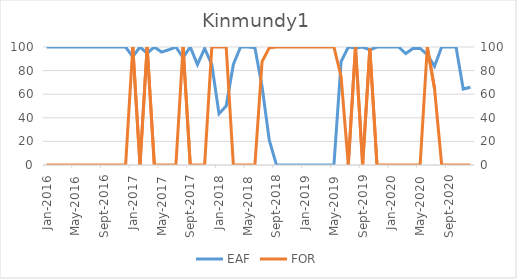
| Category | EAF |
|---|---|
| 2016-01-01 | 100 |
| 2016-02-01 | 100 |
| 2016-03-01 | 100 |
| 2016-04-01 | 100 |
| 2016-05-01 | 100 |
| 2016-06-01 | 100 |
| 2016-07-01 | 100 |
| 2016-08-01 | 100 |
| 2016-09-01 | 100 |
| 2016-10-01 | 100 |
| 2016-11-01 | 100 |
| 2016-12-01 | 100 |
| 2017-01-01 | 91.67 |
| 2017-02-01 | 100 |
| 2017-03-01 | 94.75 |
| 2017-04-01 | 100 |
| 2017-05-01 | 95.7 |
| 2017-06-01 | 97.64 |
| 2017-07-01 | 100 |
| 2017-08-01 | 91.09 |
| 2017-09-01 | 100 |
| 2017-10-01 | 85.08 |
| 2017-11-01 | 98.82 |
| 2017-12-01 | 85.08 |
| 2018-01-01 | 43.42 |
| 2018-02-01 | 50 |
| 2018-03-01 | 85.2 |
| 2018-04-01 | 100 |
| 2018-05-01 | 100 |
| 2018-06-01 | 99.45 |
| 2018-07-01 | 66.27 |
| 2018-08-01 | 21.01 |
| 2018-09-01 | 0 |
| 2018-10-01 | 0 |
| 2018-11-01 | 0 |
| 2018-12-01 | 0 |
| 2019-01-01 | 0 |
| 2019-02-01 | 0 |
| 2019-03-01 | 0 |
| 2019-04-01 | 0 |
| 2019-05-01 | 0 |
| 2019-06-01 | 87.54 |
| 2019-07-01 | 100 |
| 2019-08-01 | 99.2 |
| 2019-09-01 | 100 |
| 2019-10-01 | 97.63 |
| 2019-11-01 | 100 |
| 2019-12-01 | 100 |
| 2020-01-01 | 100 |
| 2020-02-01 | 100 |
| 2020-03-01 | 94.48 |
| 2020-04-01 | 98.75 |
| 2020-05-01 | 98.81 |
| 2020-06-01 | 93.66 |
| 2020-07-01 | 83.71 |
| 2020-08-01 | 100 |
| 2020-09-01 | 100 |
| 2020-10-01 | 100 |
| 2020-11-01 | 64.35 |
| 2020-12-01 | 65.86 |